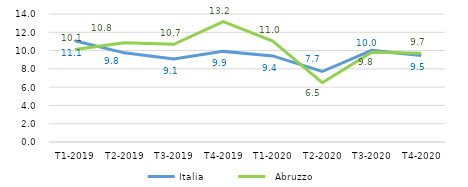
| Category | Italia |   Abruzzo |
|---|---|---|
|   T1-2019 | 11.068 | 10.129 |
|   T2-2019 | 9.751 | 10.85 |
|   T3-2019 | 9.075 | 10.686 |
|   T4-2019 | 9.911 | 13.172 |
|   T1-2020 | 9.417 | 11.029 |
|   T2-2020 | 7.71 | 6.484 |
|   T3-2020 | 10.02 | 9.821 |
|   T4-2020 | 9.461 | 9.7 |